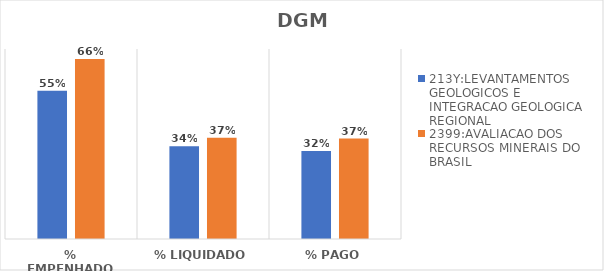
| Category | 213Y:LEVANTAMENTOS GEOLOGICOS E INTEGRACAO GEOLOGICA REGIONAL | 2399:AVALIACAO DOS RECURSOS MINERAIS DO BRASIL |
|---|---|---|
| % EMPENHADO | 0.546 | 0.663 |
| % LIQUIDADO | 0.342 | 0.373 |
| % PAGO | 0.324 | 0.37 |